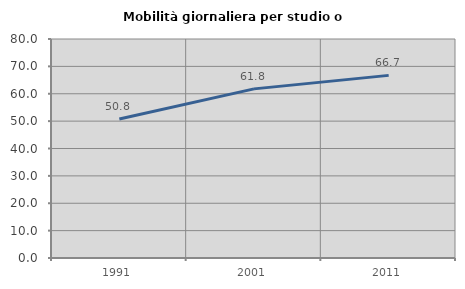
| Category | Mobilità giornaliera per studio o lavoro |
|---|---|
| 1991.0 | 50.787 |
| 2001.0 | 61.779 |
| 2011.0 | 66.713 |